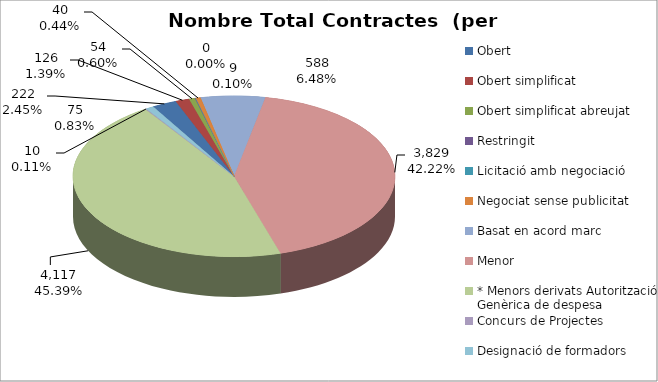
| Category | Nombre Total Contractes |
|---|---|
| Obert | 222 |
| Obert simplificat | 126 |
| Obert simplificat abreujat | 54 |
| Restringit | 9 |
| Licitació amb negociació | 0 |
| Negociat sense publicitat | 40 |
| Basat en acord marc | 588 |
| Menor | 3829 |
| * Menors derivats Autorització Genèrica de despesa | 4117 |
| Concurs de Projectes | 10 |
| Designació de formadors | 75 |